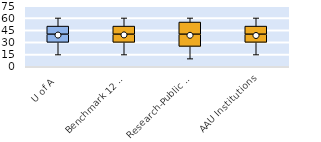
| Category | 25th | 50th | 75th |
|---|---|---|---|
| U of A | 30 | 10 | 10 |
| Benchmark 12 & SEC | 30 | 10 | 10 |
| Research-Public Univ | 25 | 15 | 15 |
| AAU Institutions | 30 | 10 | 10 |